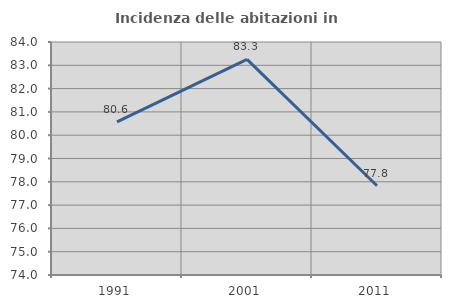
| Category | Incidenza delle abitazioni in proprietà  |
|---|---|
| 1991.0 | 80.571 |
| 2001.0 | 83.251 |
| 2011.0 | 77.833 |